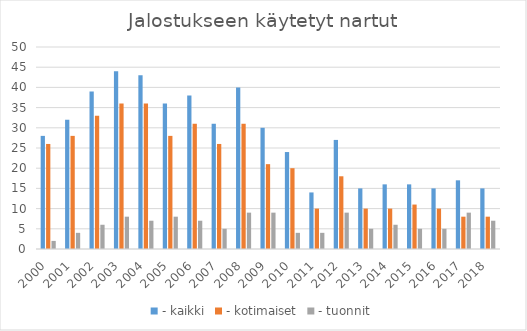
| Category | - kaikki | - kotimaiset | - tuonnit |
|---|---|---|---|
| 2000.0 | 28 | 26 | 2 |
| 2001.0 | 32 | 28 | 4 |
| 2002.0 | 39 | 33 | 6 |
| 2003.0 | 44 | 36 | 8 |
| 2004.0 | 43 | 36 | 7 |
| 2005.0 | 36 | 28 | 8 |
| 2006.0 | 38 | 31 | 7 |
| 2007.0 | 31 | 26 | 5 |
| 2008.0 | 40 | 31 | 9 |
| 2009.0 | 30 | 21 | 9 |
| 2010.0 | 24 | 20 | 4 |
| 2011.0 | 14 | 10 | 4 |
| 2012.0 | 27 | 18 | 9 |
| 2013.0 | 15 | 10 | 5 |
| 2014.0 | 16 | 10 | 6 |
| 2015.0 | 16 | 11 | 5 |
| 2016.0 | 15 | 10 | 5 |
| 2017.0 | 17 | 8 | 9 |
| 2018.0 | 15 | 8 | 7 |